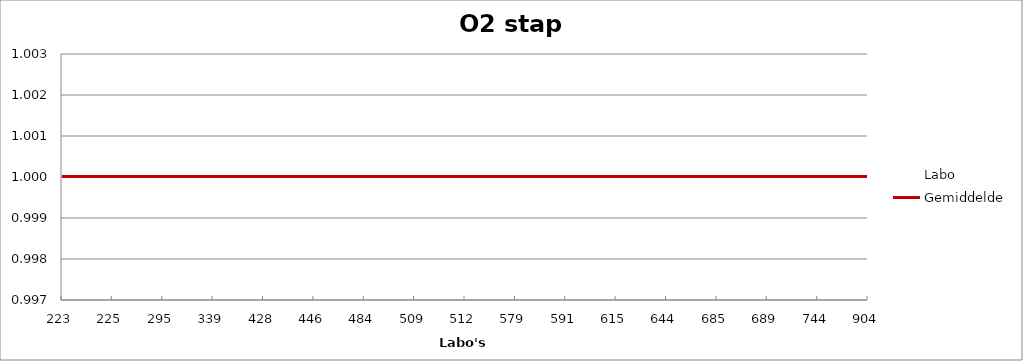
| Category | Labo | Gemiddelde |
|---|---|---|
| 223.0 | 1.001 | 1 |
| 225.0 | 1 | 1 |
| 295.0 | 1 | 1 |
| 339.0 | 1.002 | 1 |
| 428.0 | 0.999 | 1 |
| 446.0 | 0.999 | 1 |
| 484.0 | 1.001 | 1 |
| 509.0 | 1 | 1 |
| 512.0 | 1 | 1 |
| 579.0 | 1 | 1 |
| 591.0 | 0.999 | 1 |
| 615.0 | 0.999 | 1 |
| 644.0 | 1 | 1 |
| 685.0 | 1 | 1 |
| 689.0 | 1.001 | 1 |
| 744.0 | 1 | 1 |
| 904.0 | 1 | 1 |